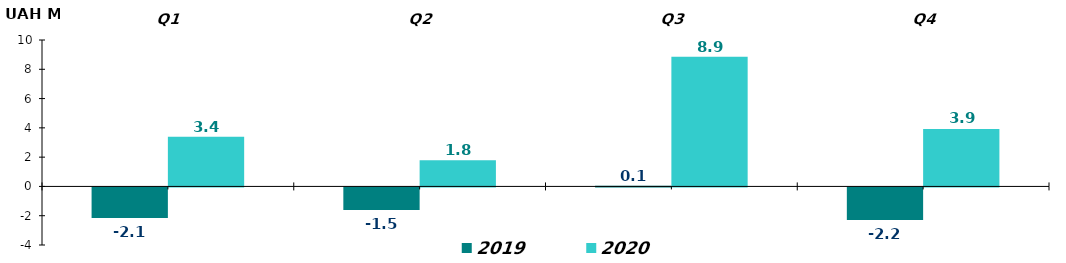
| Category | 2019 | 2020 |
|---|---|---|
| Q1 | -2.08 | 3.4 |
| Q2 | -1.54 | 1.78 |
| Q3 | 0.05 | 8.85 |
| Q4 | -2.22 | 3.93 |